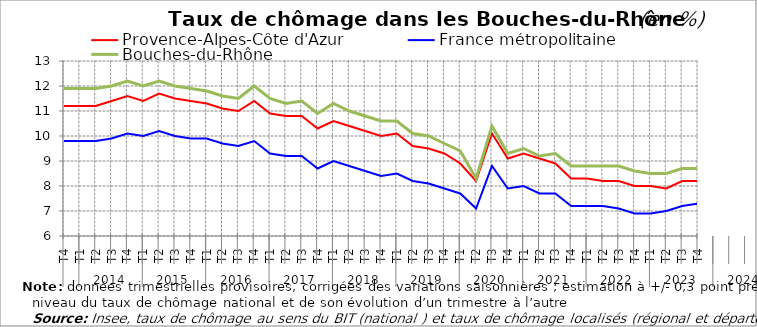
| Category | Provence-Alpes-Côte d'Azur | France métropolitaine | Bouches-du-Rhône |
|---|---|---|---|
| 0 | 11.2 | 9.8 | 11.9 |
| 1 | 11.2 | 9.8 | 11.9 |
| 2 | 11.2 | 9.8 | 11.9 |
| 3 | 11.4 | 9.9 | 12 |
| 4 | 11.6 | 10.1 | 12.2 |
| 5 | 11.4 | 10 | 12 |
| 6 | 11.7 | 10.2 | 12.2 |
| 7 | 11.5 | 10 | 12 |
| 8 | 11.4 | 9.9 | 11.9 |
| 9 | 11.3 | 9.9 | 11.8 |
| 10 | 11.1 | 9.7 | 11.6 |
| 11 | 11 | 9.6 | 11.5 |
| 12 | 11.4 | 9.8 | 12 |
| 13 | 10.9 | 9.3 | 11.5 |
| 14 | 10.8 | 9.2 | 11.3 |
| 15 | 10.8 | 9.2 | 11.4 |
| 16 | 10.3 | 8.7 | 10.9 |
| 17 | 10.6 | 9 | 11.3 |
| 18 | 10.4 | 8.8 | 11 |
| 19 | 10.2 | 8.6 | 10.8 |
| 20 | 10 | 8.4 | 10.6 |
| 21 | 10.1 | 8.5 | 10.6 |
| 22 | 9.6 | 8.2 | 10.1 |
| 23 | 9.5 | 8.1 | 10 |
| 24 | 9.3 | 7.9 | 9.7 |
| 25 | 8.9 | 7.7 | 9.4 |
| 26 | 8.2 | 7.1 | 8.3 |
| 27 | 10.1 | 8.8 | 10.4 |
| 28 | 9.1 | 7.9 | 9.3 |
| 29 | 9.3 | 8 | 9.5 |
| 30 | 9.1 | 7.7 | 9.2 |
| 31 | 8.9 | 7.7 | 9.3 |
| 32 | 8.3 | 7.2 | 8.8 |
| 33 | 8.3 | 7.2 | 8.8 |
| 34 | 8.2 | 7.2 | 8.8 |
| 35 | 8.2 | 7.1 | 8.8 |
| 36 | 8 | 6.9 | 8.6 |
| 37 | 8 | 6.9 | 8.5 |
| 38 | 7.9 | 7 | 8.5 |
| 39 | 8.2 | 7.2 | 8.7 |
| 40 | 8.2 | 7.3 | 8.7 |